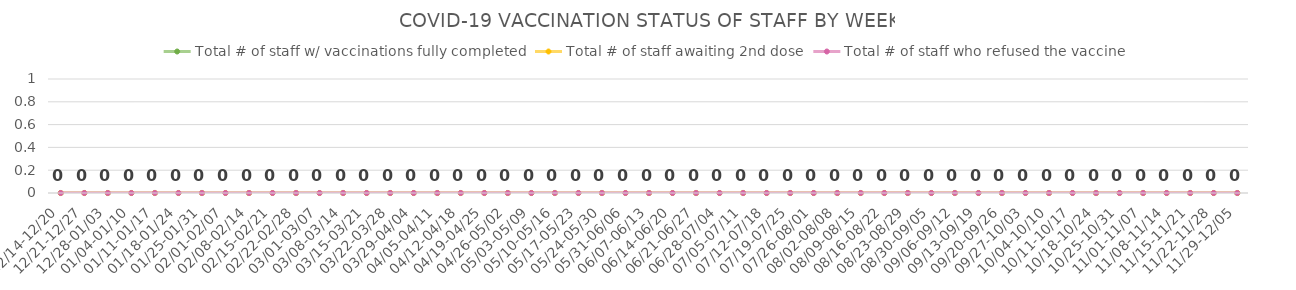
| Category | Total # of staff w/ vaccinations fully completed | Total # of staff awaiting 2nd dose | Total # of staff who refused the vaccine |
|---|---|---|---|
| 12/14-12/20 | 0 | 0 | 0 |
| 12/21-12/27 | 0 | 0 | 0 |
| 12/28-01/03 | 0 | 0 | 0 |
| 01/04-01/10 | 0 | 0 | 0 |
| 01/11-01/17 | 0 | 0 | 0 |
| 01/18-01/24 | 0 | 0 | 0 |
| 01/25-01/31 | 0 | 0 | 0 |
| 02/01-02/07 | 0 | 0 | 0 |
| 02/08-02/14 | 0 | 0 | 0 |
| 02/15-02/21 | 0 | 0 | 0 |
| 02/22-02/28 | 0 | 0 | 0 |
| 03/01-03/07 | 0 | 0 | 0 |
| 03/08-03/14 | 0 | 0 | 0 |
| 03/15-03/21 | 0 | 0 | 0 |
| 03/22-03/28 | 0 | 0 | 0 |
| 03/29-04/04 | 0 | 0 | 0 |
| 04/05-04/11 | 0 | 0 | 0 |
| 04/12-04/18 | 0 | 0 | 0 |
| 04/19-04/25 | 0 | 0 | 0 |
| 04/26-05/02 | 0 | 0 | 0 |
| 05/03-05/09 | 0 | 0 | 0 |
| 05/10-05/16 | 0 | 0 | 0 |
| 05/17-05/23 | 0 | 0 | 0 |
| 05/24-05/30 | 0 | 0 | 0 |
| 05/31-06/06 | 0 | 0 | 0 |